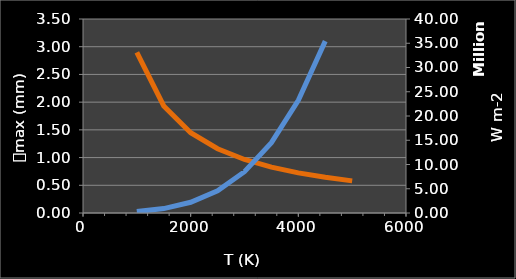
| Category | Series 1 |
|---|---|
| 1000.0 | 2.897 |
| 1500.0 | 1.931 |
| 2000.0 | 1.448 |
| 2500.0 | 1.159 |
| 3000.0 | 0.966 |
| 3500.0 | 0.828 |
| 4000.0 | 0.724 |
| 4500.0 | 0.644 |
| 5000.0 | 0.579 |